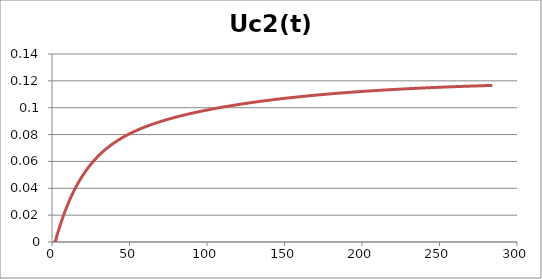
| Category | Uc2(t) |
|---|---|
| 0 | 0 |
| 1 | 0 |
| 2 | 0.004 |
| 3 | 0.008 |
| 4 | 0.012 |
| 5 | 0.015 |
| 6 | 0.018 |
| 7 | 0.022 |
| 8 | 0.025 |
| 9 | 0.027 |
| 10 | 0.03 |
| 11 | 0.033 |
| 12 | 0.035 |
| 13 | 0.038 |
| 14 | 0.04 |
| 15 | 0.042 |
| 16 | 0.044 |
| 17 | 0.046 |
| 18 | 0.048 |
| 19 | 0.05 |
| 20 | 0.052 |
| 21 | 0.053 |
| 22 | 0.055 |
| 23 | 0.056 |
| 24 | 0.058 |
| 25 | 0.059 |
| 26 | 0.06 |
| 27 | 0.062 |
| 28 | 0.063 |
| 29 | 0.064 |
| 30 | 0.065 |
| 31 | 0.066 |
| 32 | 0.067 |
| 33 | 0.068 |
| 34 | 0.069 |
| 35 | 0.07 |
| 36 | 0.071 |
| 37 | 0.072 |
| 38 | 0.073 |
| 39 | 0.074 |
| 40 | 0.075 |
| 41 | 0.075 |
| 42 | 0.076 |
| 43 | 0.077 |
| 44 | 0.077 |
| 45 | 0.078 |
| 46 | 0.079 |
| 47 | 0.079 |
| 48 | 0.08 |
| 49 | 0.081 |
| 50 | 0.081 |
| 51 | 0.082 |
| 52 | 0.082 |
| 53 | 0.083 |
| 54 | 0.083 |
| 55 | 0.084 |
| 56 | 0.084 |
| 57 | 0.085 |
| 58 | 0.085 |
| 59 | 0.086 |
| 60 | 0.086 |
| 61 | 0.087 |
| 62 | 0.087 |
| 63 | 0.087 |
| 64 | 0.088 |
| 65 | 0.088 |
| 66 | 0.089 |
| 67 | 0.089 |
| 68 | 0.089 |
| 69 | 0.09 |
| 70 | 0.09 |
| 71 | 0.09 |
| 72 | 0.091 |
| 73 | 0.091 |
| 74 | 0.091 |
| 75 | 0.092 |
| 76 | 0.092 |
| 77 | 0.092 |
| 78 | 0.093 |
| 79 | 0.093 |
| 80 | 0.093 |
| 81 | 0.094 |
| 82 | 0.094 |
| 83 | 0.094 |
| 84 | 0.094 |
| 85 | 0.095 |
| 86 | 0.095 |
| 87 | 0.095 |
| 88 | 0.096 |
| 89 | 0.096 |
| 90 | 0.096 |
| 91 | 0.096 |
| 92 | 0.097 |
| 93 | 0.097 |
| 94 | 0.097 |
| 95 | 0.097 |
| 96 | 0.098 |
| 97 | 0.098 |
| 98 | 0.098 |
| 99 | 0.098 |
| 100 | 0.098 |
| 101 | 0.099 |
| 102 | 0.099 |
| 103 | 0.099 |
| 104 | 0.099 |
| 105 | 0.1 |
| 106 | 0.1 |
| 107 | 0.1 |
| 108 | 0.1 |
| 109 | 0.1 |
| 110 | 0.101 |
| 111 | 0.101 |
| 112 | 0.101 |
| 113 | 0.101 |
| 114 | 0.101 |
| 115 | 0.102 |
| 116 | 0.102 |
| 117 | 0.102 |
| 118 | 0.102 |
| 119 | 0.102 |
| 120 | 0.103 |
| 121 | 0.103 |
| 122 | 0.103 |
| 123 | 0.103 |
| 124 | 0.103 |
| 125 | 0.103 |
| 126 | 0.104 |
| 127 | 0.104 |
| 128 | 0.104 |
| 129 | 0.104 |
| 130 | 0.104 |
| 131 | 0.104 |
| 132 | 0.105 |
| 133 | 0.105 |
| 134 | 0.105 |
| 135 | 0.105 |
| 136 | 0.105 |
| 137 | 0.105 |
| 138 | 0.105 |
| 139 | 0.106 |
| 140 | 0.106 |
| 141 | 0.106 |
| 142 | 0.106 |
| 143 | 0.106 |
| 144 | 0.106 |
| 145 | 0.106 |
| 146 | 0.107 |
| 147 | 0.107 |
| 148 | 0.107 |
| 149 | 0.107 |
| 150 | 0.107 |
| 151 | 0.107 |
| 152 | 0.107 |
| 153 | 0.107 |
| 154 | 0.108 |
| 155 | 0.108 |
| 156 | 0.108 |
| 157 | 0.108 |
| 158 | 0.108 |
| 159 | 0.108 |
| 160 | 0.108 |
| 161 | 0.108 |
| 162 | 0.109 |
| 163 | 0.109 |
| 164 | 0.109 |
| 165 | 0.109 |
| 166 | 0.109 |
| 167 | 0.109 |
| 168 | 0.109 |
| 169 | 0.109 |
| 170 | 0.109 |
| 171 | 0.11 |
| 172 | 0.11 |
| 173 | 0.11 |
| 174 | 0.11 |
| 175 | 0.11 |
| 176 | 0.11 |
| 177 | 0.11 |
| 178 | 0.11 |
| 179 | 0.11 |
| 180 | 0.11 |
| 181 | 0.111 |
| 182 | 0.111 |
| 183 | 0.111 |
| 184 | 0.111 |
| 185 | 0.111 |
| 186 | 0.111 |
| 187 | 0.111 |
| 188 | 0.111 |
| 189 | 0.111 |
| 190 | 0.111 |
| 191 | 0.111 |
| 192 | 0.112 |
| 193 | 0.112 |
| 194 | 0.112 |
| 195 | 0.112 |
| 196 | 0.112 |
| 197 | 0.112 |
| 198 | 0.112 |
| 199 | 0.112 |
| 200 | 0.112 |
| 201 | 0.112 |
| 202 | 0.112 |
| 203 | 0.112 |
| 204 | 0.112 |
| 205 | 0.113 |
| 206 | 0.113 |
| 207 | 0.113 |
| 208 | 0.113 |
| 209 | 0.113 |
| 210 | 0.113 |
| 211 | 0.113 |
| 212 | 0.113 |
| 213 | 0.113 |
| 214 | 0.113 |
| 215 | 0.113 |
| 216 | 0.113 |
| 217 | 0.113 |
| 218 | 0.113 |
| 219 | 0.114 |
| 220 | 0.114 |
| 221 | 0.114 |
| 222 | 0.114 |
| 223 | 0.114 |
| 224 | 0.114 |
| 225 | 0.114 |
| 226 | 0.114 |
| 227 | 0.114 |
| 228 | 0.114 |
| 229 | 0.114 |
| 230 | 0.114 |
| 231 | 0.114 |
| 232 | 0.114 |
| 233 | 0.114 |
| 234 | 0.114 |
| 235 | 0.115 |
| 236 | 0.115 |
| 237 | 0.115 |
| 238 | 0.115 |
| 239 | 0.115 |
| 240 | 0.115 |
| 241 | 0.115 |
| 242 | 0.115 |
| 243 | 0.115 |
| 244 | 0.115 |
| 245 | 0.115 |
| 246 | 0.115 |
| 247 | 0.115 |
| 248 | 0.115 |
| 249 | 0.115 |
| 250 | 0.115 |
| 251 | 0.115 |
| 252 | 0.115 |
| 253 | 0.115 |
| 254 | 0.115 |
| 255 | 0.116 |
| 256 | 0.116 |
| 257 | 0.116 |
| 258 | 0.116 |
| 259 | 0.116 |
| 260 | 0.116 |
| 261 | 0.116 |
| 262 | 0.116 |
| 263 | 0.116 |
| 264 | 0.116 |
| 265 | 0.116 |
| 266 | 0.116 |
| 267 | 0.116 |
| 268 | 0.116 |
| 269 | 0.116 |
| 270 | 0.116 |
| 271 | 0.116 |
| 272 | 0.116 |
| 273 | 0.116 |
| 274 | 0.116 |
| 275 | 0.116 |
| 276 | 0.116 |
| 277 | 0.116 |
| 278 | 0.116 |
| 279 | 0.116 |
| 280 | 0.117 |
| 281 | 0.117 |
| 282 | 0.117 |
| 283 | 0.117 |